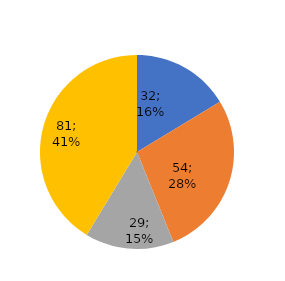
| Category | TR Nagore |
|---|---|
| Neobezbjeđeno | 32 |
| EP BiH | 54 |
| ERS | 29 |
| EP HZHB | 81 |
| EFT Stanari | 0 |